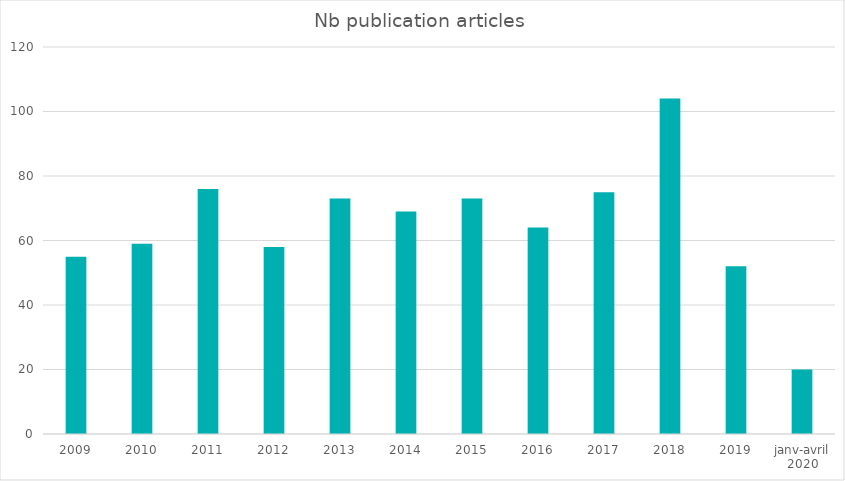
| Category | Series 0 |
|---|---|
| 2009 | 55 |
| 2010 | 59 |
| 2011 | 76 |
| 2012 | 58 |
| 2013 | 73 |
| 2014 | 69 |
| 2015 | 73 |
| 2016 | 64 |
| 2017 | 75 |
| 2018 | 104 |
| 2019 | 52 |
| janv-avril 2020 | 20 |